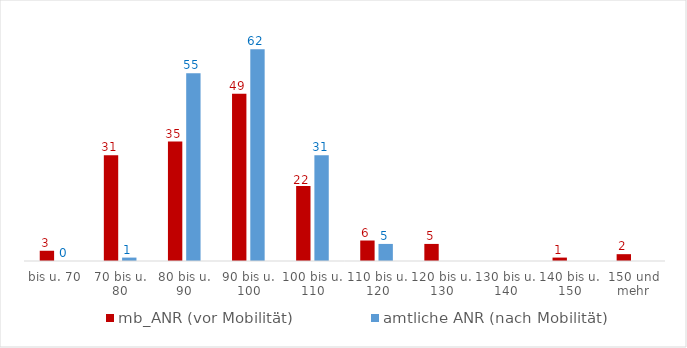
| Category | mb_ANR (vor Mobilität) | amtliche ANR (nach Mobilität) |
|---|---|---|
| bis u. 70 | 3 | 0 |
| 70 bis u. 80 | 31 | 1 |
| 80 bis u. 90 | 35 | 55 |
| 90 bis u. 100 | 49 | 62 |
| 100 bis u. 110 | 22 | 31 |
| 110 bis u. 120 | 6 | 5 |
| 120 bis u. 130 | 5 | 0 |
| 130 bis u. 140 | 0 | 0 |
| 140 bis u. 150 | 1 | 0 |
| 150 und mehr | 2 | 0 |